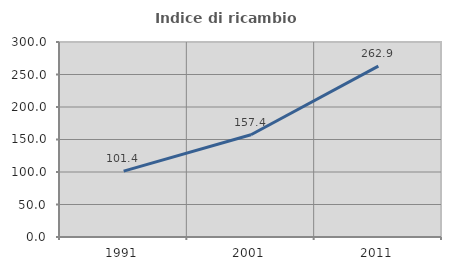
| Category | Indice di ricambio occupazionale  |
|---|---|
| 1991.0 | 101.361 |
| 2001.0 | 157.364 |
| 2011.0 | 262.857 |